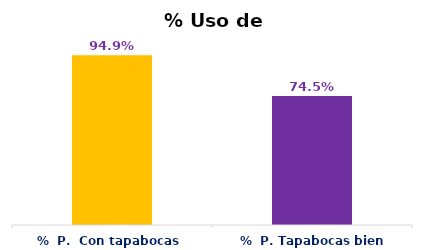
| Category | Series 0 |
|---|---|
| %  P.  Con tapabocas  | 0.949 |
| %  P. Tapabocas bien puesto | 0.745 |